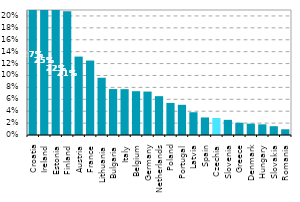
| Category | Series 0 |
|---|---|
| Croatia | 0.27 |
| Ireland | 0.25 |
| Estonia | 0.225 |
| Finland | 0.208 |
| Austria | 0.132 |
| France | 0.125 |
| Lithuania | 0.096 |
| Bulgaria | 0.077 |
| Italy | 0.077 |
| Belgium | 0.074 |
| Germany | 0.073 |
| Netherlands | 0.065 |
| Poland | 0.054 |
| Portugal | 0.051 |
| Latvia | 0.038 |
| Spain | 0.029 |
| Czechia | 0.029 |
| Slovenia | 0.025 |
| Greece | 0.021 |
| Denmark | 0.019 |
| Hungary | 0.018 |
| Slovakia | 0.015 |
| Romania | 0.01 |